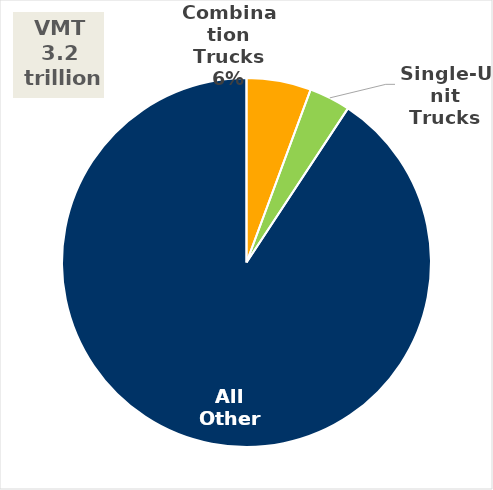
| Category | VMT (Trillions) |
|---|---|
| Combination Trucks | 0.181 |
| Single-Unit Trucks | 0.116 |
| All Other | 2.915 |